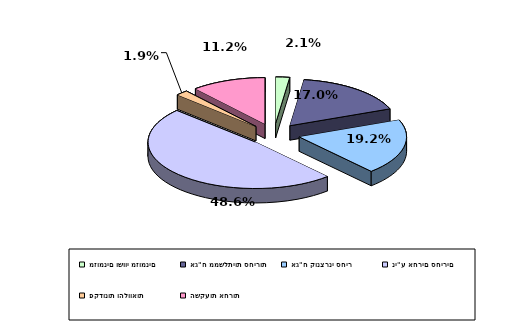
| Category | Series 0 |
|---|---|
| מזומנים ושווי מזומנים | 0.021 |
| אג"ח ממשלתיות סחירות | 0.17 |
| אג"ח קונצרני סחיר | 0.192 |
| ני"ע אחרים סחירים | 0.486 |
| פקדונות והלוואות | 0.019 |
| השקעות אחרות | 0.112 |